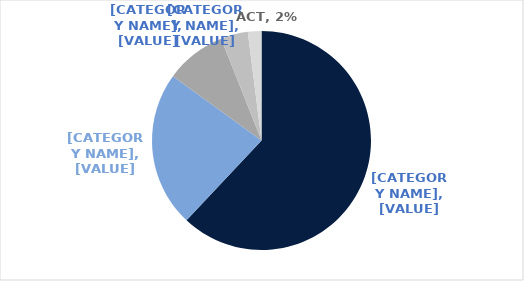
| Category | Series 0 |
|---|---|
| NSW | 0.62 |
| VIC | 0.23 |
| QLD | 0.09 |
| WA | 0.04 |
| ACT | 0.02 |